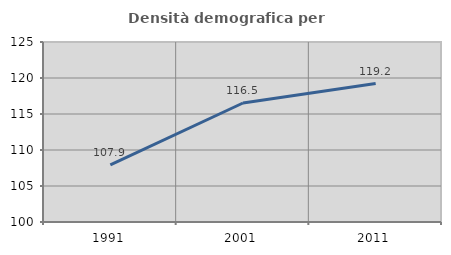
| Category | Densità demografica |
|---|---|
| 1991.0 | 107.945 |
| 2001.0 | 116.526 |
| 2011.0 | 119.236 |